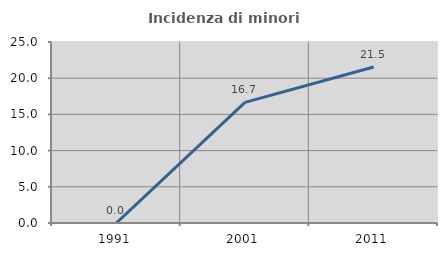
| Category | Incidenza di minori stranieri |
|---|---|
| 1991.0 | 0 |
| 2001.0 | 16.667 |
| 2011.0 | 21.538 |